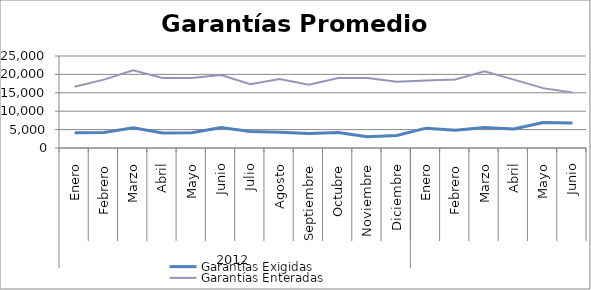
| Category | Garantías Exigidas | Garantías Enteradas |
|---|---|---|
| 0 | 4146.8 | 16662.483 |
| 1 | 4190.531 | 18572.749 |
| 2 | 5482.211 | 21128.648 |
| 3 | 4079.038 | 18997.51 |
| 4 | 4141.554 | 19005.364 |
| 5 | 5549.139 | 19818.91 |
| 6 | 4487.023 | 17351.39 |
| 7 | 4277.924 | 18719.955 |
| 8 | 3940.893 | 17217.403 |
| 9 | 4180.69 | 19046.939 |
| 10 | 3056.997 | 19028.425 |
| 11 | 3426.799 | 17994.819 |
| 12 | 5390.461 | 18317.043 |
| 13 | 4807.91 | 18608.477 |
| 14 | 5582.739 | 20850.446 |
| 15 | 5196.755 | 18583.166 |
| 16 | 6912.615 | 16266.455 |
| 17 | 6790.981 | 15108.06 |